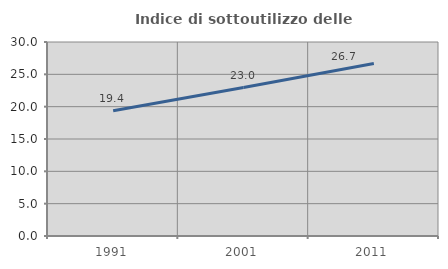
| Category | Indice di sottoutilizzo delle abitazioni  |
|---|---|
| 1991.0 | 19.361 |
| 2001.0 | 22.964 |
| 2011.0 | 26.68 |